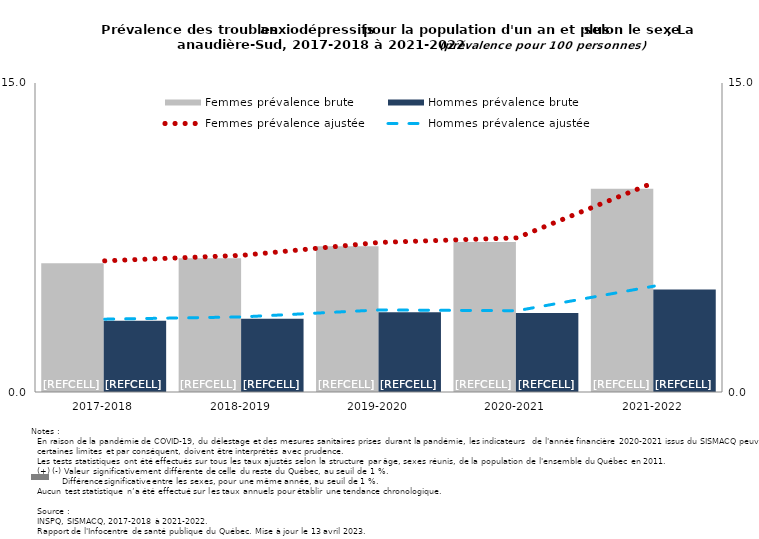
| Category | Femmes prévalence brute | Hommes prévalence brute |
|---|---|---|
| 2017-2018 | 6.249 | 3.462 |
| 2018-2019 | 6.487 | 3.556 |
| 2019-2020 | 7.073 | 3.875 |
| 2020-2021 | 7.278 | 3.831 |
| 2021-2022 | 9.865 | 4.971 |